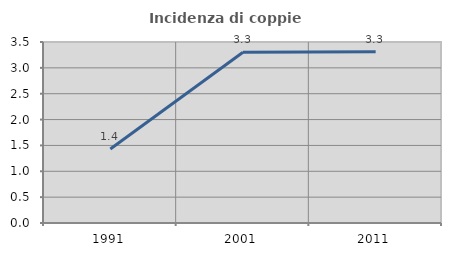
| Category | Incidenza di coppie miste |
|---|---|
| 1991.0 | 1.43 |
| 2001.0 | 3.302 |
| 2011.0 | 3.311 |